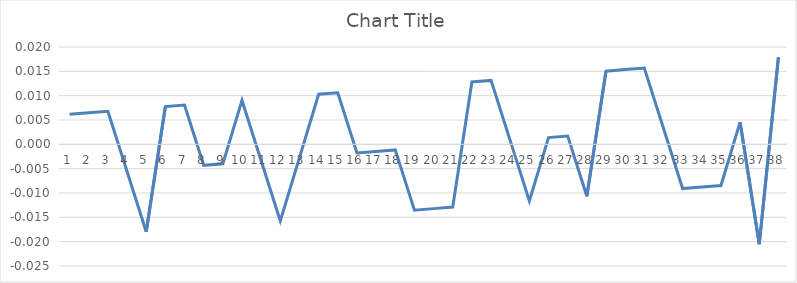
| Category | Series 0 |
|---|---|
| 0 | 0.006 |
| 1 | 0.006 |
| 2 | 0.007 |
| 3 | -0.006 |
| 4 | -0.018 |
| 5 | 0.008 |
| 6 | 0.008 |
| 7 | -0.004 |
| 8 | -0.004 |
| 9 | 0.009 |
| 10 | -0.003 |
| 11 | -0.016 |
| 12 | -0.003 |
| 13 | 0.01 |
| 14 | 0.011 |
| 15 | -0.002 |
| 16 | -0.001 |
| 17 | -0.001 |
| 18 | -0.014 |
| 19 | -0.013 |
| 20 | -0.013 |
| 21 | 0.013 |
| 22 | 0.013 |
| 23 | 0.001 |
| 24 | -0.012 |
| 25 | 0.001 |
| 26 | 0.002 |
| 27 | -0.011 |
| 28 | 0.015 |
| 29 | 0.015 |
| 30 | 0.016 |
| 31 | 0.003 |
| 32 | -0.009 |
| 33 | -0.009 |
| 34 | -0.008 |
| 35 | 0.005 |
| 36 | -0.021 |
| 37 | 0.018 |